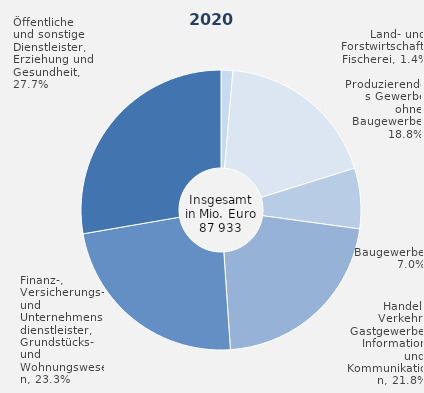
| Category | 2020 |
|---|---|
| Land- und Forstwirtschaft, Fischerei | 0.014 |
| Produzierendes Gewerbe ohne Baugewerbe | 0.188 |
| Baugewerbe | 0.07 |
| Handel, Verkehr, Gastgewerbe, Information und Kommunikation | 0.218 |
| Finanz-, Versicherungs- und Unternehmensdienstleister, Grundstücks- und Wohnungswesen | 0.233 |
| Öffentliche und sonstige Dienstleister, Erziehung und Gesundheit | 0.277 |